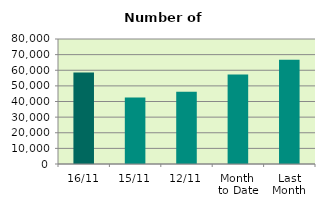
| Category | Series 0 |
|---|---|
| 16/11 | 58568 |
| 15/11 | 42568 |
| 12/11 | 46302 |
| Month 
to Date | 57293.667 |
| Last
Month | 66688.857 |